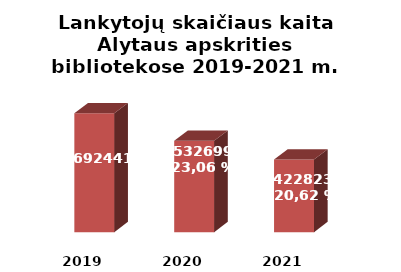
| Category | Series 0 |
|---|---|
| 2019.0 | 692441 |
| 2020.0 | 532699 |
| 2021.0 | 422823 |